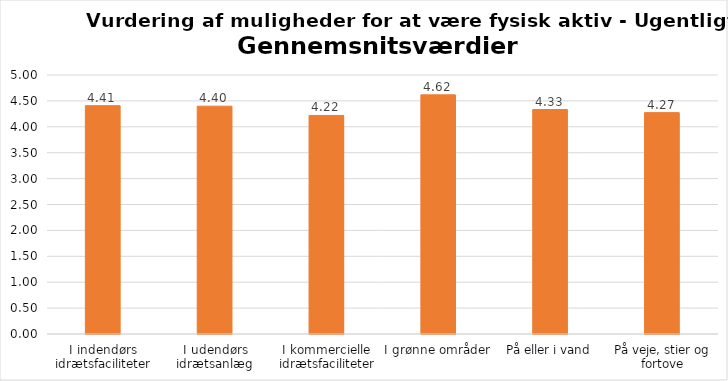
| Category | Gennemsnit |
|---|---|
| I indendørs idrætsfaciliteter | 4.408 |
| I udendørs idrætsanlæg | 4.398 |
| I kommercielle idrætsfaciliteter | 4.219 |
| I grønne områder | 4.617 |
| På eller i vand | 4.333 |
| På veje, stier og fortove | 4.274 |